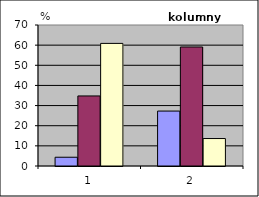
| Category | Series 0 | Series 1 | Series 2 |
|---|---|---|---|
| 0 | 4.348 | 34.783 | 60.87 |
| 1 | 27.273 | 59.091 | 13.636 |